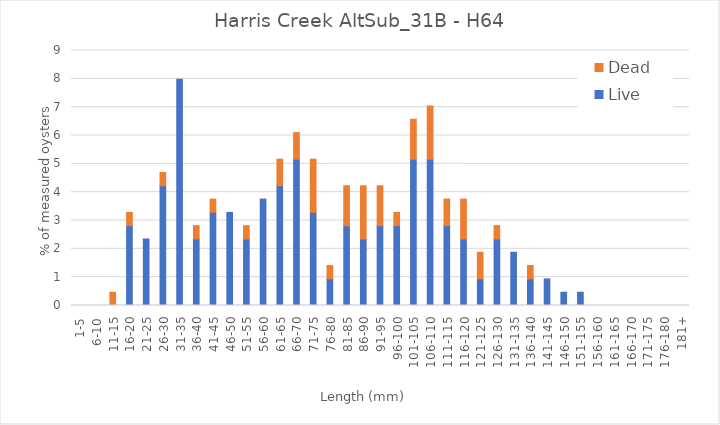
| Category | Live | Dead |
|---|---|---|
| 1-5 | 0 | 0 |
| 6-10 | 0 | 0 |
| 11-15 | 0 | 0.469 |
| 16-20 | 2.817 | 0.469 |
| 21-25 | 2.347 | 0 |
| 26-30 | 4.225 | 0.469 |
| 31-35 | 7.981 | 0 |
| 36-40 | 2.347 | 0.469 |
| 41-45 | 3.286 | 0.469 |
| 46-50 | 3.286 | 0 |
| 51-55 | 2.347 | 0.469 |
| 56-60 | 3.756 | 0 |
| 61-65 | 4.225 | 0.939 |
| 66-70 | 5.164 | 0.939 |
| 71-75 | 3.286 | 1.878 |
| 76-80 | 0.939 | 0.469 |
| 81-85 | 2.817 | 1.408 |
| 86-90 | 2.347 | 1.878 |
| 91-95 | 2.817 | 1.408 |
| 96-100 | 2.817 | 0.469 |
| 101-105 | 5.164 | 1.408 |
| 106-110 | 5.164 | 1.878 |
| 111-115 | 2.817 | 0.939 |
| 116-120 | 2.347 | 1.408 |
| 121-125 | 0.939 | 0.939 |
| 126-130 | 2.347 | 0.469 |
| 131-135 | 1.878 | 0 |
| 136-140 | 0.939 | 0.469 |
| 141-145 | 0.939 | 0 |
| 146-150 | 0.469 | 0 |
| 151-155 | 0.469 | 0 |
| 156-160 | 0 | 0 |
| 161-165 | 0 | 0 |
| 166-170 | 0 | 0 |
| 171-175 | 0 | 0 |
| 176-180 | 0 | 0 |
| 181+ | 0 | 0 |